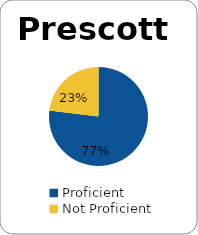
| Category | Series 0 |
|---|---|
| Proficient | 0.769 |
| Not Proficient | 0.231 |